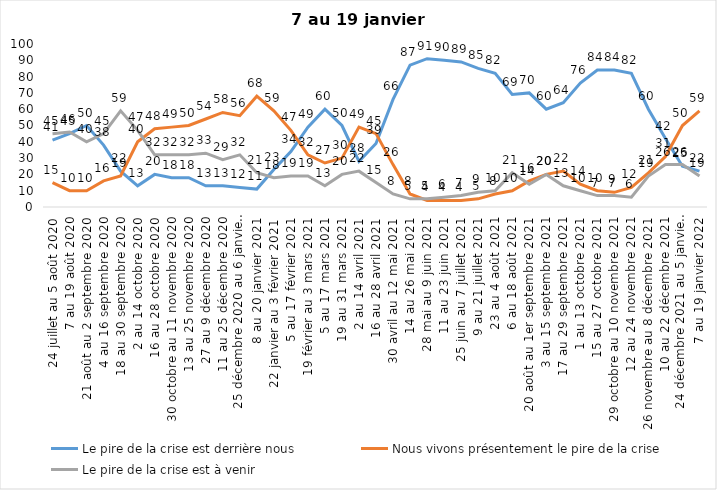
| Category | Le pire de la crise est derrière nous | Nous vivons présentement le pire de la crise | Le pire de la crise est à venir |
|---|---|---|---|
| 24 juillet au 5 août 2020 | 41 | 15 | 45 |
| 7 au 19 août 2020 | 45 | 10 | 46 |
| 21 août au 2 septembre 2020 | 50 | 10 | 40 |
| 4 au 16 septembre 2020 | 38 | 16 | 45 |
| 18 au 30 septembre 2020 | 22 | 19 | 59 |
| 2 au 14 octobre 2020 | 13 | 40 | 47 |
| 16 au 28 octobre 2020 | 20 | 48 | 32 |
| 30 octobre au 11 novembre 2020 | 18 | 49 | 32 |
| 13 au 25 novembre 2020 | 18 | 50 | 32 |
| 27 au 9 décembre 2020 | 13 | 54 | 33 |
| 11 au 25 décembre 2020 | 13 | 58 | 29 |
| 25 décembre 2020 au 6 janvier 2021 | 12 | 56 | 32 |
| 8 au 20 janvier 2021 | 11 | 68 | 21 |
| 22 janvier au 3 février 2021 | 23 | 59 | 18 |
| 5 au 17 février 2021 | 34 | 47 | 19 |
| 19 février au 3 mars 2021 | 49 | 32 | 19 |
| 5 au 17 mars 2021 | 60 | 27 | 13 |
| 19 au 31 mars 2021 | 50 | 30 | 20 |
| 2 au 14 avril 2021 | 28 | 49 | 22 |
| 16 au 28 avril 2021 | 39 | 45 | 15 |
| 30 avril au 12 mai 2021 | 66 | 26 | 8 |
| 14 au 26 mai 2021 | 87 | 8 | 5 |
| 28 mai au 9 juin 2021 | 91 | 4 | 5 |
| 11 au 23 juin 2021 | 90 | 4 | 6 |
| 25 juin au 7 juillet 2021 | 89 | 4 | 7 |
| 9 au 21 juillet 2021 | 85 | 5 | 9 |
| 23 au 4 août 2021 | 82 | 8 | 10 |
| 6 au 18 août 2021 | 69 | 10 | 21 |
| 20 août au 1er septembre 2021 | 70 | 16 | 14 |
| 3 au 15 septembre 2021 | 60 | 20 | 20 |
| 17 au 29 septembre 2021 | 64 | 22 | 13 |
| 1 au 13 octobre 2021 | 76 | 14 | 10 |
| 15 au 27 octobre 2021 | 84 | 10 | 7 |
| 29 octobre au 10 novembre 2021 | 84 | 9 | 7 |
| 12 au 24 novembre 2021 | 82 | 12 | 6 |
| 26 novembre au 8 décembre 2021 | 60 | 21 | 19 |
| 10 au 22 décembre 2021 | 42 | 31 | 26 |
| 24 décembre 2021 au 5 janvier 2022 2022 | 25 | 50 | 26 |
| 7 au 19 janvier 2022 | 22 | 59 | 19 |